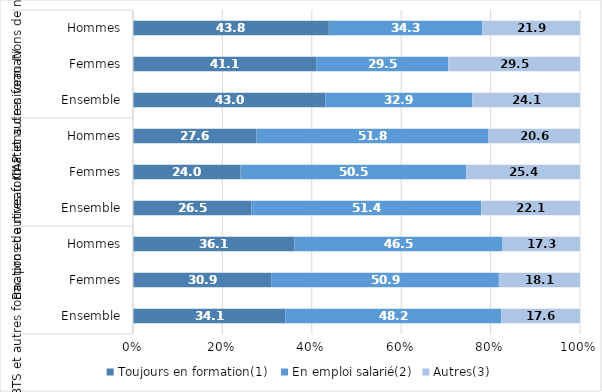
| Category | Toujours en formation(1)  | En emploi salarié(2) | Autres(3) |
|---|---|---|---|
| 0 | 34.139 | 48.22 | 17.641 |
| 1 | 30.92 | 50.937 | 18.143 |
| 2 | 36.142 | 46.529 | 17.329 |
| 3 | 26.523 | 51.401 | 22.077 |
| 4 | 24.043 | 50.54 | 25.417 |
| 5 | 27.638 | 51.788 | 20.574 |
| 6 | 43.009 | 32.905 | 24.086 |
| 7 | 41.088 | 29.456 | 29.456 |
| 8 | 43.804 | 34.33 | 21.866 |